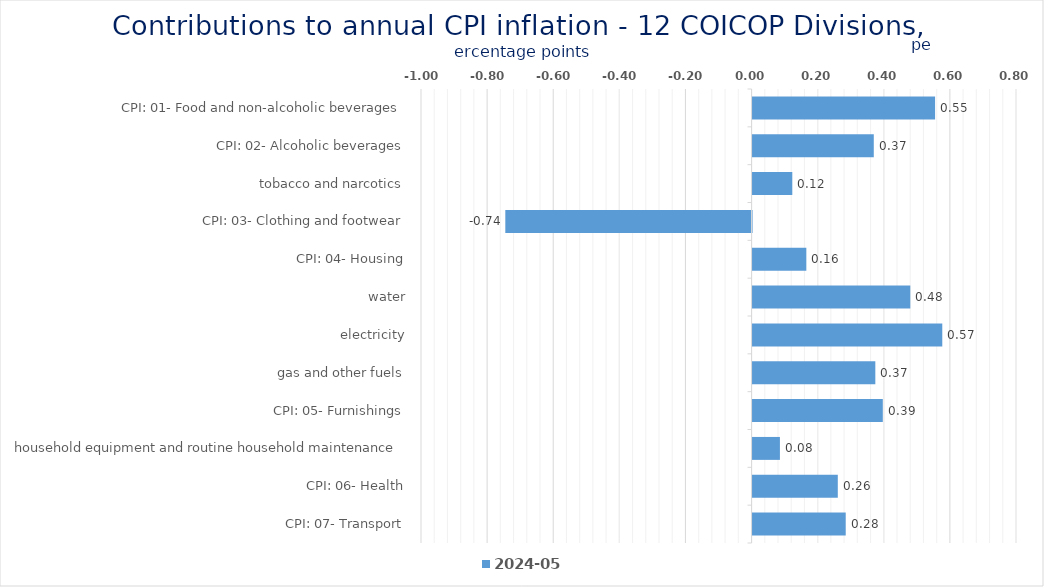
| Category | 2024-05 |
|---|---|
| CPI: 01- Food and non-alcoholic beverages | 0.552 |
| CPI: 02- Alcoholic beverages, tobacco and narcotics | 0.367 |
| CPI: 03- Clothing and footwear | 0.12 |
| CPI: 04- Housing, water, electricity, gas and other fuels | -0.745 |
| CPI: 05- Furnishings, household equipment and routine household maintenance | 0.163 |
| CPI: 06- Health | 0.477 |
| CPI: 07- Transport | 0.574 |
| CPI: 08- Communication | 0.371 |
| CPI: 09- Recreation and culture | 0.394 |
| CPI: 10- Education | 0.083 |
| CPI: 11- Restaurants and hotels | 0.258 |
| CPI: 12- Miscellaneous goods and services | 0.282 |